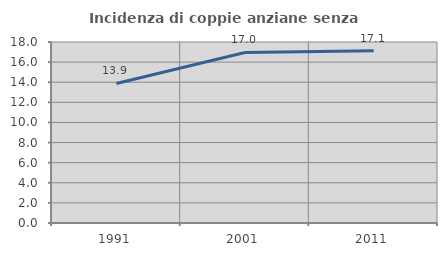
| Category | Incidenza di coppie anziane senza figli  |
|---|---|
| 1991.0 | 13.876 |
| 2001.0 | 16.957 |
| 2011.0 | 17.13 |